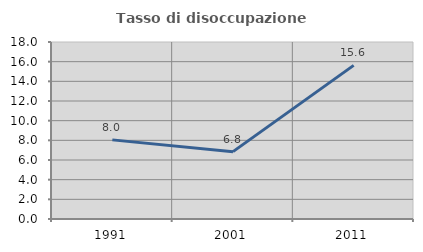
| Category | Tasso di disoccupazione giovanile  |
|---|---|
| 1991.0 | 8.046 |
| 2001.0 | 6.849 |
| 2011.0 | 15.625 |